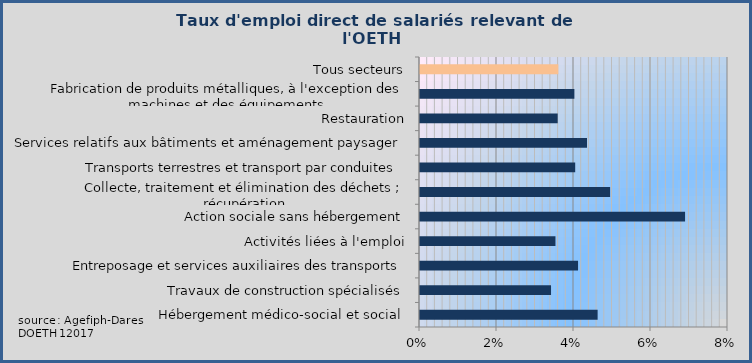
| Category | Series 0 |
|---|---|
| Hébergement médico-social et social | 0.046 |
| Travaux de construction spécialisés | 0.034 |
| Entreposage et services auxiliaires des transports | 0.041 |
| Activités liées à l'emploi | 0.035 |
| Action sociale sans hébergement | 0.069 |
| Collecte, traitement et élimination des déchets ; récupération | 0.049 |
| Transports terrestres et transport par conduites | 0.04 |
| Services relatifs aux bâtiments et aménagement paysager | 0.043 |
| Restauration | 0.036 |
| Fabrication de produits métalliques, à l'exception des machines et des équipements | 0.04 |
| Tous secteurs | 0.036 |